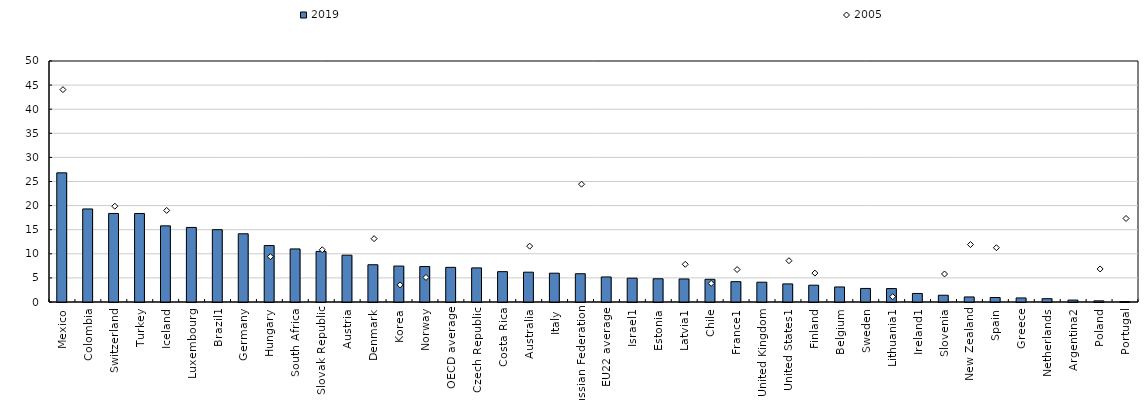
| Category | 2019 |
|---|---|
| Mexico | 26.795 |
| Colombia | 19.307 |
| Switzerland | 18.364 |
| Turkey | 18.356 |
| Iceland | 15.799 |
| Luxembourg | 15.47 |
| Brazil1 | 15.004 |
| Germany | 14.152 |
| Hungary | 11.711 |
| South Africa | 11.01 |
| Slovak Republic | 10.495 |
| Austria | 9.714 |
| Denmark | 7.729 |
| Korea | 7.456 |
| Norway | 7.36 |
| OECD average | 7.188 |
| Czech Republic | 7.075 |
| Costa Rica | 6.296 |
| Australia | 6.186 |
| Italy | 5.976 |
| Russian Federation | 5.862 |
| EU22 average | 5.195 |
| Israel1 | 4.944 |
| Estonia | 4.82 |
| Latvia1 | 4.779 |
| Chile | 4.708 |
| France1 | 4.218 |
| United Kingdom | 4.106 |
| United States1 | 3.751 |
| Finland | 3.485 |
| Belgium | 3.12 |
| Sweden | 2.811 |
| Lithuania1 | 2.789 |
| Ireland1 | 1.772 |
| Slovenia | 1.4 |
| New Zealand | 1.049 |
| Spain | 0.931 |
| Greece | 0.84 |
| Netherlands | 0.688 |
| Argentina2 | 0.4 |
| Poland | 0.242 |
| Portugal | 0.085 |